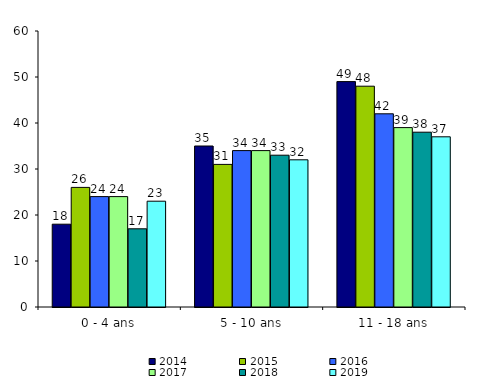
| Category | 2014 | 2015 | 2016 | 2017 | 2018 | 2019 |
|---|---|---|---|---|---|---|
| 0 - 4 ans | 18 | 26 | 24 | 24 | 17 | 23 |
| 5 - 10 ans | 35 | 31 | 34 | 34 | 33 | 32 |
| 11 - 18 ans | 49 | 48 | 42 | 39 | 38 | 37 |